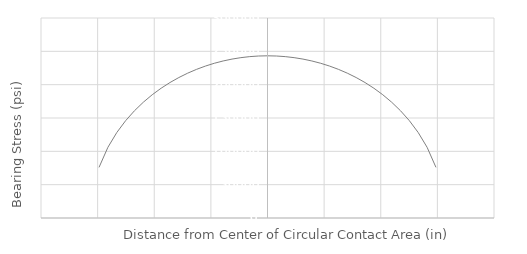
| Category | Series 0 |
|---|---|
| -0.059502783606921884 | 75965.808 |
| -0.05637105815392599 | 106045.599 |
| -0.053239332700930106 | 128158.479 |
| -0.05010760724793421 | 145971.174 |
| -0.04697588179493833 | 160918.094 |
| -0.04384415634194244 | 173740.449 |
| -0.04071243088894655 | 184880.814 |
| -0.03758070543595066 | 194628.232 |
| -0.03444897998295478 | 203183.275 |
| -0.031317254529958885 | 210691.242 |
| -0.028185529076962996 | 217260.711 |
| -0.025053803623967107 | 222974.652 |
| -0.02192207817097122 | 227897.423 |
| -0.01879035271797533 | 232079.375 |
| -0.015658627264979443 | 235559.969 |
| -0.012526901811983553 | 238369.929 |
| -0.009395176358987666 | 240532.76 |
| -0.006263450905991777 | 242065.807 |
| -0.0031317254529958883 | 242980.993 |
| 0.0 | 243285.29 |
| 0.0031317254529958883 | 242980.993 |
| 0.006263450905991777 | 242065.807 |
| 0.009395176358987666 | 240532.76 |
| 0.012526901811983553 | 238369.929 |
| 0.015658627264979443 | 235559.969 |
| 0.01879035271797533 | 232079.375 |
| 0.02192207817097122 | 227897.423 |
| 0.025053803623967107 | 222974.652 |
| 0.028185529076962996 | 217260.711 |
| 0.031317254529958885 | 210691.242 |
| 0.03444897998295478 | 203183.275 |
| 0.03758070543595066 | 194628.232 |
| 0.04071243088894655 | 184880.814 |
| 0.04384415634194244 | 173740.449 |
| 0.04697588179493833 | 160918.094 |
| 0.05010760724793421 | 145971.174 |
| 0.053239332700930106 | 128158.479 |
| 0.05637105815392599 | 106045.599 |
| 0.059502783606921884 | 75965.808 |